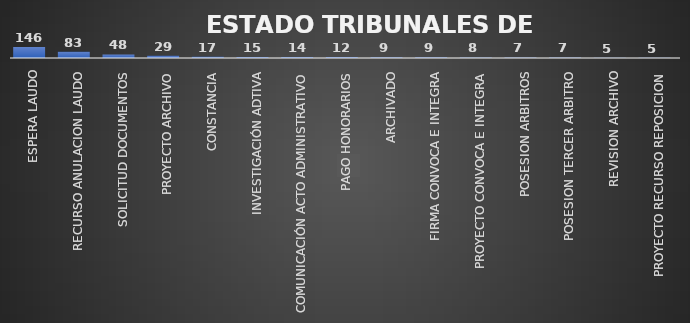
| Category | Series 0 | Series 1 |
|---|---|---|
| ESPERA LAUDO | 146 | 0.308 |
| RECURSO ANULACION LAUDO | 83 | 0.108 |
| SOLICITUD DOCUMENTOS | 48 | 0.178 |
| PROYECTO ARCHIVO | 29 | 0.061 |
| CONSTANCIA | 17 | 0.061 |
| INVESTIGACIÓN ADTIVA | 15 | 0.019 |
| COMUNICACIÓN ACTO ADMINISTRATIVO | 14 | 0.034 |
| PAGO HONORARIOS | 12 | 0.014 |
| ARCHIVADO | 9 | 0.01 |
| FIRMA CONVOCA E INTEGRA | 9 | 0.027 |
| PROYECTO CONVOCA E INTEGRA | 8 | 0.02 |
| POSESION ARBITROS | 7 | 0.021 |
| POSESION TERCER ARBITRO | 7 | 0.025 |
| REVISION ARCHIVO | 5 | 0.006 |
| PROYECTO RECURSO REPOSICION | 5 | 0.015 |